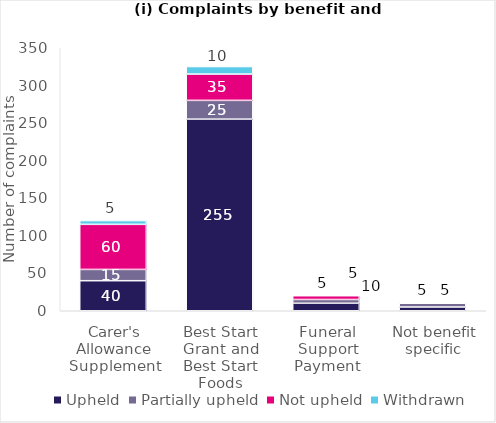
| Category | Upheld | Partially upheld | Not upheld | Withdrawn |
|---|---|---|---|---|
| Carer's Allowance Supplement | 40 | 15 | 60 | 5 |
| Best Start Grant and Best Start Foods | 255 | 25 | 35 | 10 |
| Funeral Support Payment | 10 | 5 | 5 | 0 |
| Not benefit specific | 5 | 5 | 0 | 0 |